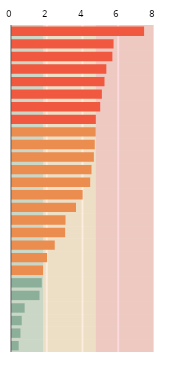
| Category | Обл A | Обл B | Обл C |
|---|---|---|---|
| кружка | 1793989 | 2952133 | 3253878 |
| тарелка | 1793989 | 2952133 | 3253878 |
| накидка | 1793989 | 2952133 | 3253878 |
| защита | 1793989 | 2952133 | 3253878 |
| гермоупаковка | 1793989 | 2952133 | 3253878 |
| бандана | 1793989 | 2952133 | 3253878 |
| ремешок | 1793989 | 2952133 | 3253878 |
| фонарь | 1793989 | 2952133 | 3253878 |
| перчатки | 1793989 | 2952133 | 3253878 |
| ложка | 1793989 | 2952133 | 3253878 |
| гетры | 1793989 | 2952133 | 3253878 |
| душ походный | 1793989 | 2952133 | 3253878 |
| шапка | 1793989 | 2952133 | 3253878 |
| ролики | 1793989 | 2952133 | 3253878 |
| шезлонг | 1793989 | 2952133 | 3253878 |
| лопата | 1793989 | 2952133 | 3253878 |
| термос | 1793989 | 2952133 | 3253878 |
| шипы | 1793989 | 2952133 | 3253878 |
| сумка | 1793989 | 2952133 | 3253878 |
| гамаши | 1793989 | 2952133 | 3253878 |
| рюкзак | 1793989 | 2952133 | 3253878 |
| балаклава | 1793989 | 2952133 | 3253878 |
| гидратор | 1793989 | 2952133 | 3253878 |
| щуп лавинный | 1793989 | 2952133 | 3253878 |
| гамак | 1793989 | 2952133 | 3253878 |
| лампа | 1793989 | 2952133 | 3253878 |